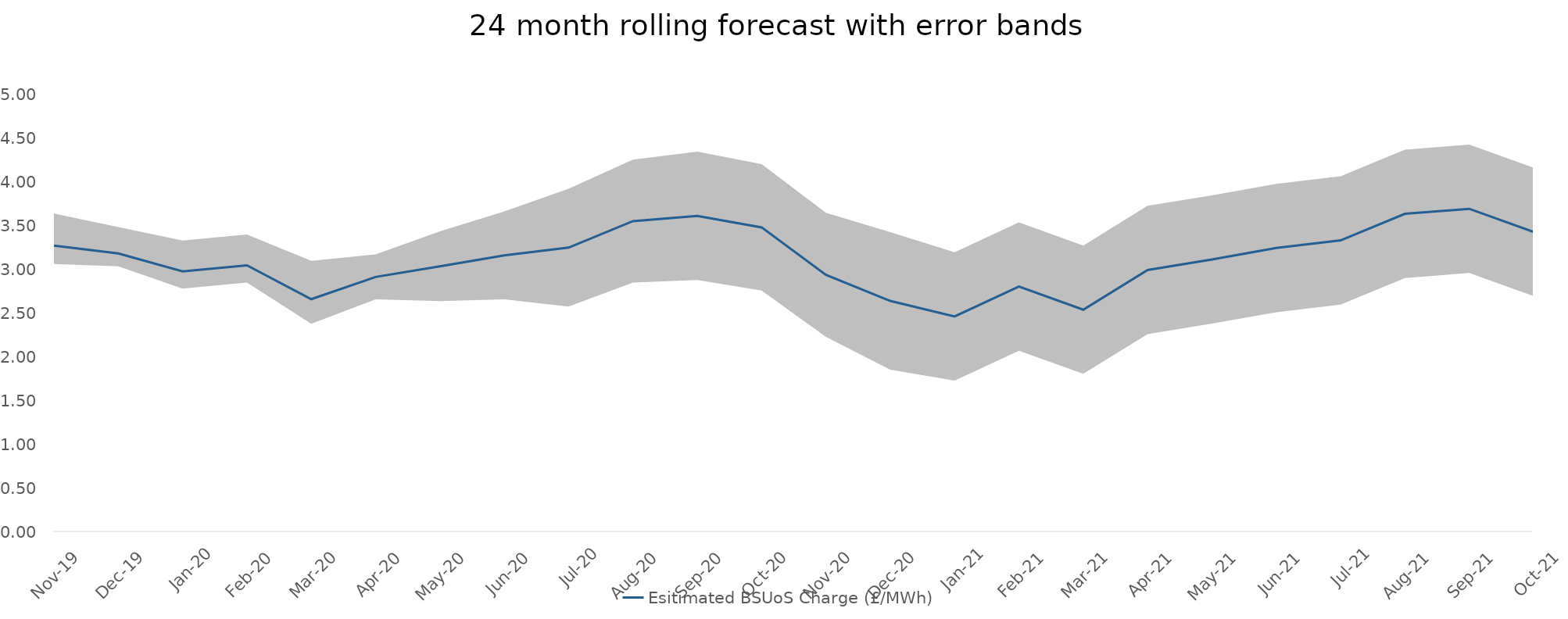
| Category | Esitimated BSUoS Charge (£/MWh) |
|---|---|
| Nov-19 | 3.271 |
| Dec-19 | 3.182 |
| Jan-20 | 2.977 |
| Feb-20 | 3.045 |
| Mar-20 | 2.659 |
| Apr-20 | 2.913 |
| May-20 | 3.035 |
| Jun-20 | 3.159 |
| Jul-20 | 3.249 |
| Aug-20 | 3.552 |
| Sep-20 | 3.612 |
| Oct-20 | 3.48 |
| Nov-20 | 2.937 |
| Dec-20 | 2.638 |
| Jan-21 | 2.461 |
| Feb-21 | 2.803 |
| Mar-21 | 2.538 |
| Apr-21 | 2.993 |
| May-21 | 3.113 |
| Jun-21 | 3.244 |
| Jul-21 | 3.331 |
| Aug-21 | 3.635 |
| Sep-21 | 3.693 |
| Oct-21 | 3.428 |